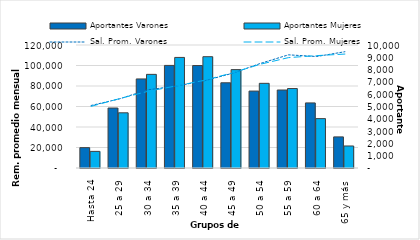
| Category | Aportantes Varones | Aportantes Mujeres |
|---|---|---|
| Hasta 24 | 1654 | 1351 |
| 25 a 29 | 4876 | 4487 |
| 30 a 34 | 7241 | 7613 |
| 35 a 39 | 8340 | 8990 |
| 40 a 44 | 8330 | 9049 |
| 45 a 49 | 6928 | 7998 |
| 50 a 54 | 6254 | 6883 |
| 55 a 59 | 6339 | 6460 |
| 60 a 64 | 5290 | 4015 |
| 65 y más | 2528 | 1790 |